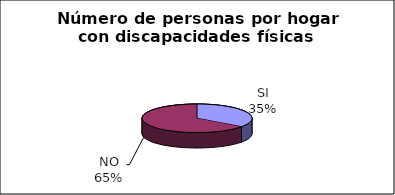
| Category | Series 0 |
|---|---|
| SI | 106.05 |
| NO | 196.95 |